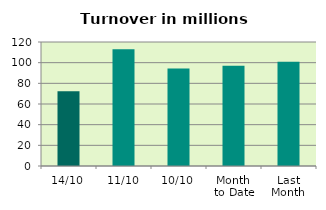
| Category | Series 0 |
|---|---|
| 14/10 | 72.382 |
| 11/10 | 113.08 |
| 10/10 | 94.258 |
| Month 
to Date | 97.134 |
| Last
Month | 100.935 |